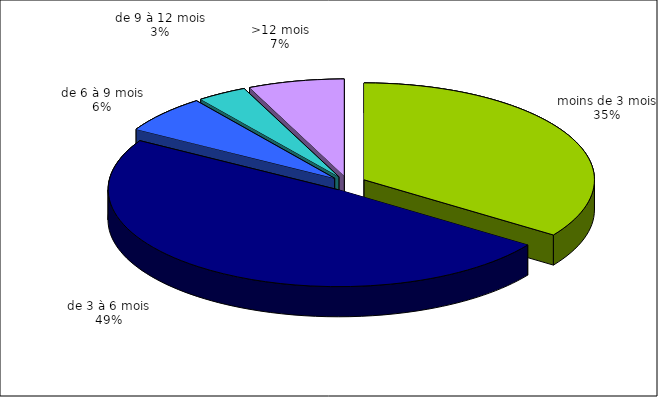
| Category | Series 0 |
|---|---|
| moins de 3 mois | 308 |
| de 3 à 6 mois | 434 |
| de 6 à 9 mois | 56 |
| de 9 à 12 mois | 31 |
| >12 mois | 60 |